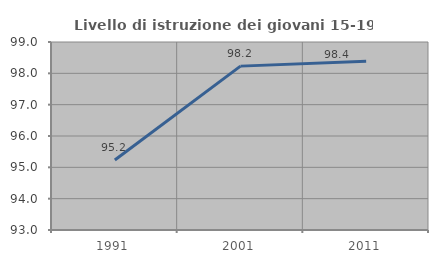
| Category | Livello di istruzione dei giovani 15-19 anni |
|---|---|
| 1991.0 | 95.234 |
| 2001.0 | 98.23 |
| 2011.0 | 98.389 |